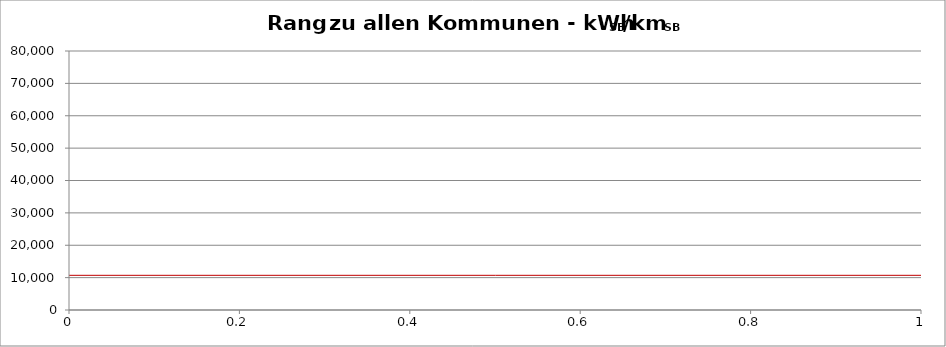
| Category | Kommunenrangfolge |
|---|---|
| 0 | 8.214 |
| 1 | 9.286 |
| 2 | 11.829 |
| 3 | 106.05 |
| 4 | 170 |
| 5 | 800 |
| 6 | 1249.743 |
| 7 | 1357.2 |
| 8 | 1676.667 |
| 9 | 2050 |
| 10 | 2400 |
| 11 | 3080 |
| 12 | 3092.413 |
| 13 | 3098.714 |
| 14 | 3115 |
| 15 | 3166.667 |
| 16 | 3214 |
| 17 | 3520 |
| 18 | 3560.333 |
| 19 | 3712 |
| 20 | 3723.75 |
| 21 | 3912 |
| 22 | 4000 |
| 23 | 4151 |
| 24 | 4221.833 |
| 25 | 4333.333 |
| 26 | 4337 |
| 27 | 4500 |
| 28 | 4537.625 |
| 29 | 4620.9 |
| 30 | 4705.882 |
| 31 | 4821.5 |
| 32 | 4821.524 |
| 33 | 4875 |
| 34 | 4980 |
| 35 | 5000 |
| 36 | 5030.667 |
| 37 | 5036.781 |
| 38 | 5083.333 |
| 39 | 5091.25 |
| 40 | 5110 |
| 41 | 5111.111 |
| 42 | 5192.417 |
| 43 | 5219 |
| 44 | 5280 |
| 45 | 5320.05 |
| 46 | 5356.667 |
| 47 | 5395.4 |
| 48 | 5419.783 |
| 49 | 5521.778 |
| 50 | 5521.816 |
| 51 | 5555.556 |
| 52 | 5646.25 |
| 53 | 5650.6 |
| 54 | 5662.85 |
| 55 | 5678.5 |
| 56 | 5683.333 |
| 57 | 5700 |
| 58 | 5714.645 |
| 59 | 5778.161 |
| 60 | 5793.889 |
| 61 | 5869.68 |
| 62 | 5909 |
| 63 | 5920.333 |
| 64 | 6043.875 |
| 65 | 6084.625 |
| 66 | 6085.5 |
| 67 | 6116.429 |
| 68 | 6135.458 |
| 69 | 6150 |
| 70 | 6181.75 |
| 71 | 6190.476 |
| 72 | 6202 |
| 73 | 6245.5 |
| 74 | 6272.727 |
| 75 | 6300 |
| 76 | 6323 |
| 77 | 6341.3 |
| 78 | 6363.5 |
| 79 | 6418.579 |
| 80 | 6438.5 |
| 81 | 6461 |
| 82 | 6520.2 |
| 83 | 6533 |
| 84 | 6534.48 |
| 85 | 6537.459 |
| 86 | 6576.667 |
| 87 | 6588.5 |
| 88 | 6598.8 |
| 89 | 6634.3 |
| 90 | 6662.222 |
| 91 | 6708.944 |
| 92 | 6752.258 |
| 93 | 6777.333 |
| 94 | 6867.5 |
| 95 | 6900 |
| 96 | 6958.921 |
| 97 | 7017.544 |
| 98 | 7048 |
| 99 | 7139 |
| 100 | 7158.4 |
| 101 | 7187.5 |
| 102 | 7205.6 |
| 103 | 7237 |
| 104 | 7278.5 |
| 105 | 7283.667 |
| 106 | 7412.5 |
| 107 | 7464 |
| 108 | 7637.16 |
| 109 | 7750 |
| 110 | 7804.025 |
| 111 | 7813.045 |
| 112 | 7817.333 |
| 113 | 7872.25 |
| 114 | 7920 |
| 115 | 8000 |
| 116 | 8093.556 |
| 117 | 8167.583 |
| 118 | 8175 |
| 119 | 8247.889 |
| 120 | 8284.5 |
| 121 | 8500 |
| 122 | 8500 |
| 123 | 8524.366 |
| 124 | 8544.2 |
| 125 | 8571.25 |
| 126 | 8617.667 |
| 127 | 8634.077 |
| 128 | 8684.615 |
| 129 | 8739.333 |
| 130 | 8784.893 |
| 131 | 8881.395 |
| 132 | 8885.4 |
| 133 | 8888.889 |
| 134 | 8905.851 |
| 135 | 8916.5 |
| 136 | 9000 |
| 137 | 9013 |
| 138 | 9031.5 |
| 139 | 9062.5 |
| 140 | 9170.286 |
| 141 | 9188.714 |
| 142 | 9200 |
| 143 | 9232.8 |
| 144 | 9313.462 |
| 145 | 9366 |
| 146 | 9402.299 |
| 147 | 9541.4 |
| 148 | 9622.5 |
| 149 | 9680.222 |
| 150 | 9709.3 |
| 151 | 9808.367 |
| 152 | 9933.8 |
| 153 | 10000 |
| 154 | 10000 |
| 155 | 10000 |
| 156 | 10000 |
| 157 | 10074.776 |
| 158 | 10094.377 |
| 159 | 10100 |
| 160 | 10166.667 |
| 161 | 10244 |
| 162 | 10325.769 |
| 163 | 10327.464 |
| 164 | 10340.8 |
| 165 | 10352.941 |
| 166 | 10405.5 |
| 167 | 10476.824 |
| 168 | 10498 |
| 169 | 10568.889 |
| 170 | 10640.875 |
| 171 | 10681.312 |
| 172 | 10714.286 |
| 173 | 11000 |
| 174 | 11052.632 |
| 175 | 11075 |
| 176 | 11214 |
| 177 | 11285.024 |
| 178 | 11385.759 |
| 179 | 11433.474 |
| 180 | 11472.773 |
| 181 | 11483.129 |
| 182 | 11794 |
| 183 | 11842.105 |
| 184 | 11904.762 |
| 185 | 11991.333 |
| 186 | 12010 |
| 187 | 12171.56 |
| 188 | 12454.25 |
| 189 | 12500 |
| 190 | 12563.8 |
| 191 | 12669.448 |
| 192 | 12819.833 |
| 193 | 12873.333 |
| 194 | 13000 |
| 195 | 13272.727 |
| 196 | 13349.016 |
| 197 | 13888.889 |
| 198 | 13954.5 |
| 199 | 14031.545 |
| 200 | 14119 |
| 201 | 14902 |
| 202 | 15284.562 |
| 203 | 15480.715 |
| 204 | 15508.4 |
| 205 | 25000 |
| 206 | 25222.222 |
| 207 | 71006 |